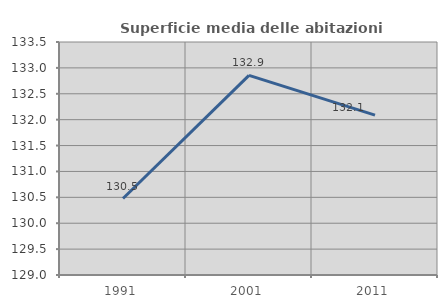
| Category | Superficie media delle abitazioni occupate |
|---|---|
| 1991.0 | 130.477 |
| 2001.0 | 132.855 |
| 2011.0 | 132.088 |